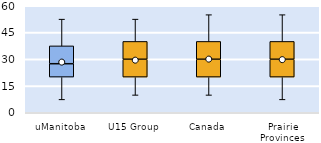
| Category | 25th | 50th | 75th |
|---|---|---|---|
| uManitoba | 20 | 7.5 | 10 |
| U15 Group | 20 | 10 | 10 |
| Canada | 20 | 10 | 10 |
| Prairie Provinces | 20 | 10 | 10 |